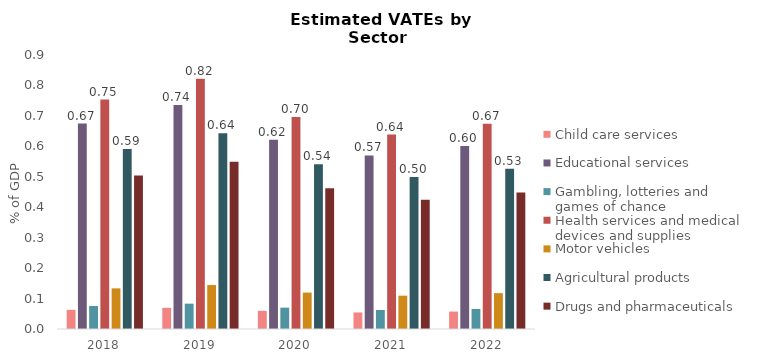
| Category | Child care services | Educational services | Gambling, lotteries and games of chance | Health services and medical devices and supplies | Motor vehicles | Agricultural products | Drugs and pharmaceuticals |
|---|---|---|---|---|---|---|---|
| 2018.0 | 0.063 | 0.675 | 0.075 | 0.753 | 0.133 | 0.591 | 0.504 |
| 2019.0 | 0.07 | 0.736 | 0.083 | 0.822 | 0.144 | 0.643 | 0.549 |
| 2020.0 | 0.06 | 0.621 | 0.07 | 0.696 | 0.12 | 0.541 | 0.462 |
| 2021.0 | 0.054 | 0.57 | 0.062 | 0.639 | 0.109 | 0.5 | 0.425 |
| 2022.0 | 0.057 | 0.601 | 0.066 | 0.674 | 0.118 | 0.526 | 0.448 |